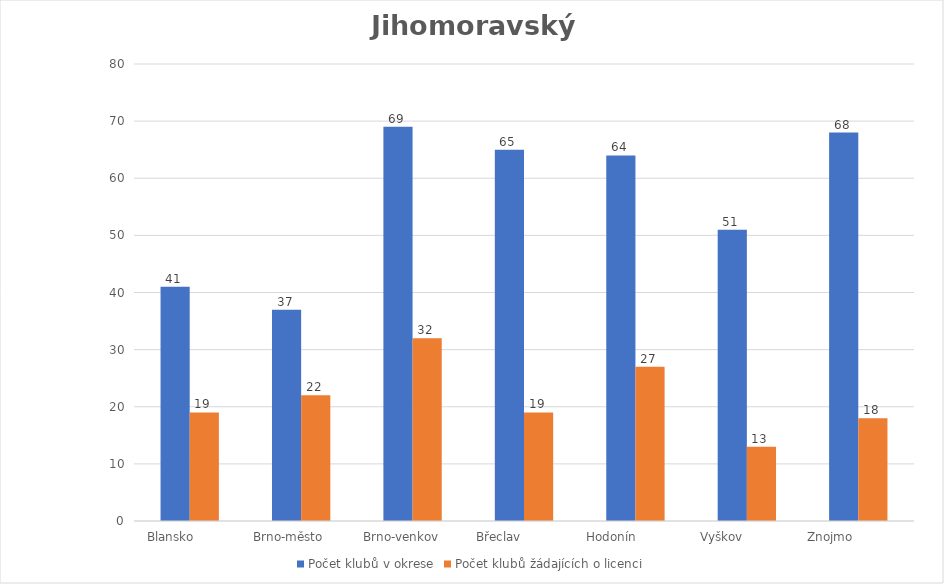
| Category | Počet klubů v okrese | Počet klubů žádajících o licenci |
|---|---|---|
| Blansko          | 41 | 19 |
| Brno-město       | 37 | 22 |
| Brno-venkov      | 69 | 32 |
| Břeclav             | 65 | 19 |
| Hodonín             | 64 | 27 |
| Vyškov             | 51 | 13 |
| Znojmo               | 68 | 18 |